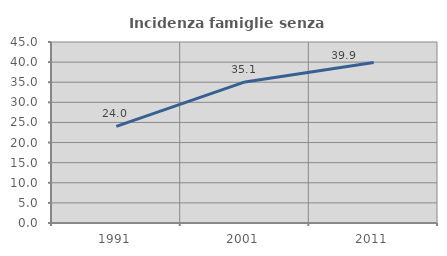
| Category | Incidenza famiglie senza nuclei |
|---|---|
| 1991.0 | 24.023 |
| 2001.0 | 35.077 |
| 2011.0 | 39.895 |